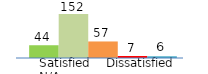
| Category | Series 0 | Series 1 | Series 2 | Series 3 | Series 4 |
|---|---|---|---|---|---|
| 0 | 44 | 152 | 57 | 7 | 6 |